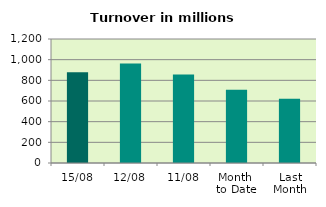
| Category | Series 0 |
|---|---|
| 15/08 | 879.358 |
| 12/08 | 961.897 |
| 11/08 | 857.446 |
| Month 
to Date | 708.552 |
| Last
Month | 622.259 |